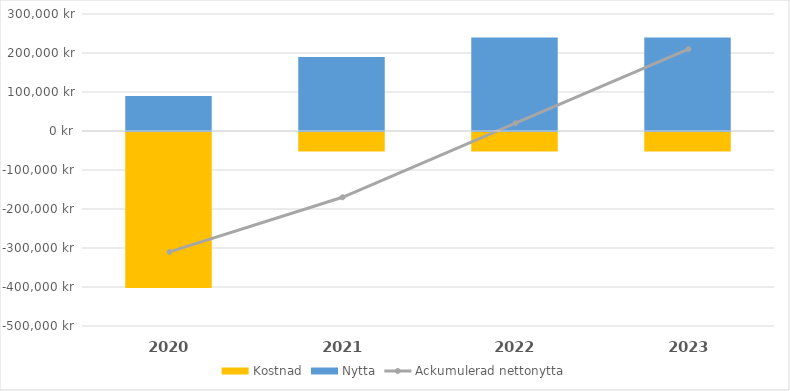
| Category | Kostnad | Nytta |
|---|---|---|
| 2020.0 | -400000 | 90000 |
| 2021.0 | -50000 | 190000 |
| 2022.0 | -50000 | 240000 |
| 2023.0 | -50000 | 240000 |